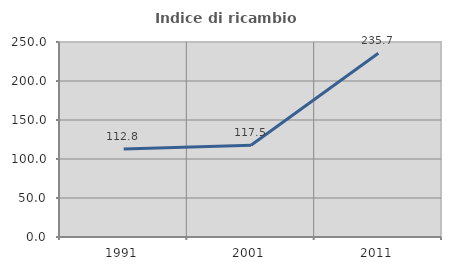
| Category | Indice di ricambio occupazionale  |
|---|---|
| 1991.0 | 112.83 |
| 2001.0 | 117.53 |
| 2011.0 | 235.652 |